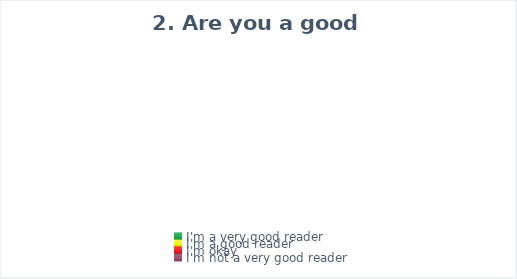
| Category | Series 0 |
|---|---|
| I'm a very good reader | 0 |
| I'm a good reader | 0 |
| I'm okay | 0 |
| I'm not a very good reader | 0 |